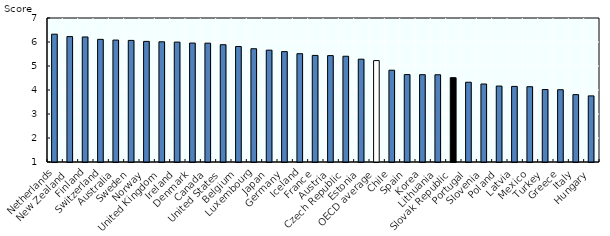
| Category | Series 0 |
|---|---|
| Netherlands | 6.326 |
| New Zealand | 6.225 |
| Finland | 6.21 |
| Switzerland | 6.11 |
| Australia | 6.08 |
| Sweden | 6.067 |
| Norway | 6.025 |
| United Kingdom | 6.009 |
| Ireland | 5.995 |
| Denmark | 5.956 |
| Canada | 5.952 |
| United States | 5.887 |
| Belgium | 5.811 |
| Luxembourg | 5.719 |
| Japan | 5.66 |
| Germany | 5.599 |
| Iceland | 5.513 |
| France | 5.441 |
| Austria | 5.433 |
| Czech Republic | 5.406 |
| Estonia | 5.284 |
| OECD average | 5.225 |
| Chile | 4.824 |
| Spain | 4.643 |
| Korea | 4.638 |
| Lithuania | 4.635 |
| Slovak Republic | 4.512 |
| Portugal | 4.324 |
| Slovenia | 4.25 |
| Poland | 4.165 |
| Latvia | 4.15 |
| Mexico | 4.137 |
| Turkey | 4.02 |
| Greece | 4.012 |
| Italy | 3.807 |
| Hungary | 3.755 |